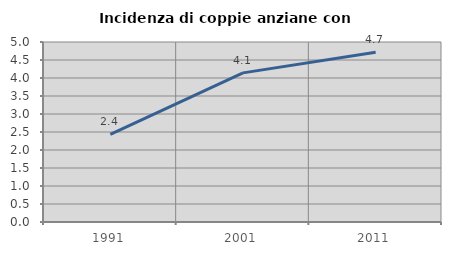
| Category | Incidenza di coppie anziane con figli |
|---|---|
| 1991.0 | 2.437 |
| 2001.0 | 4.143 |
| 2011.0 | 4.713 |